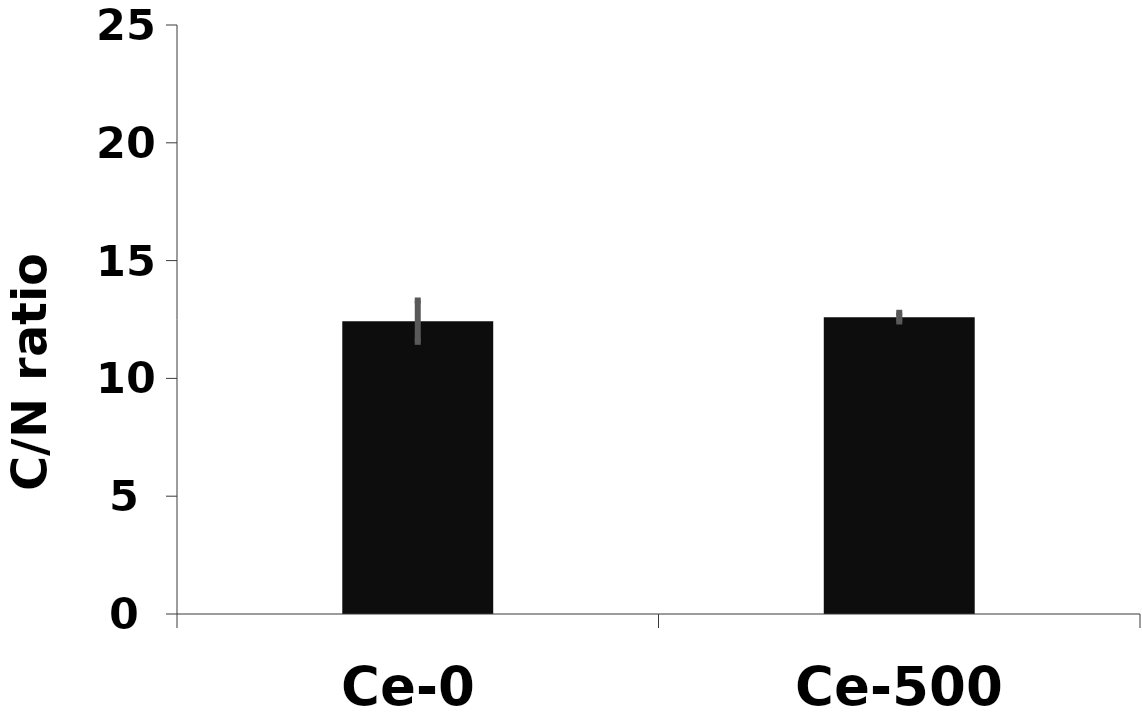
| Category | C/N |
|---|---|
| Ce-0 | 12.43 |
| Ce-500 | 12.601 |